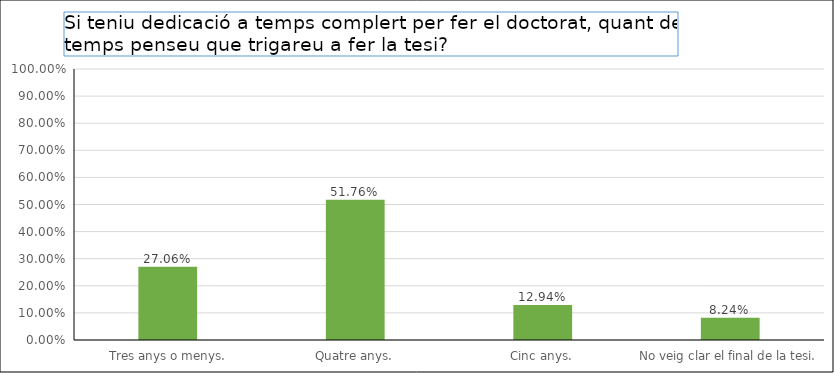
| Category | Series 0 |
|---|---|
|  Tres anys o menys. | 0.271 |
| Quatre anys. | 0.518 |
| Cinc anys. | 0.129 |
| No veig clar el final de la tesi. | 0.082 |